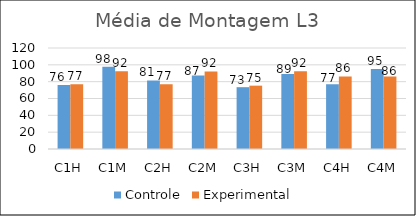
| Category | Controle | Experimental  |
|---|---|---|
| C1H | 76.1 | 76.95 |
| C1M | 97.7 | 92.28 |
| C2H | 81.4 | 76.85 |
| C2M | 87.25 | 92.2 |
| C3H | 73.45 | 75.25 |
| C3M | 89 | 92.275 |
| C4H | 76.85 | 86.15 |
| C4M | 95.15 | 86 |